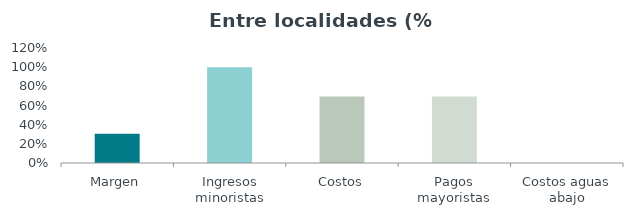
| Category | Series 0 |
|---|---|
| Margen | 0.305 |
| Ingresos minoristas | 1 |
| Costos | 0.695 |
| Pagos mayoristas | 0.694 |
| Costos aguas abajo | 0 |